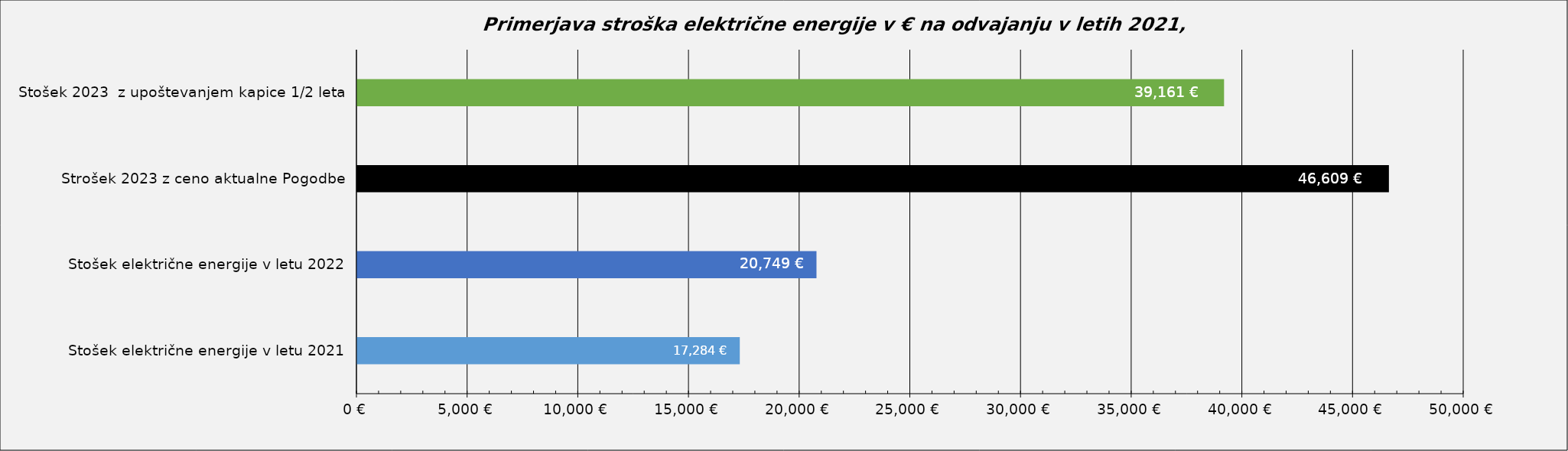
| Category | Series 0 |
|---|---|
| Stošek električne energije v letu 2021 | 17284 |
| Stošek električne energije v letu 2022 | 20748.62 |
| Strošek 2023 z ceno aktualne Pogodbe | 46608.946 |
| Stošek 2023  z upoštevanjem kapice 1/2 leta | 39161.327 |